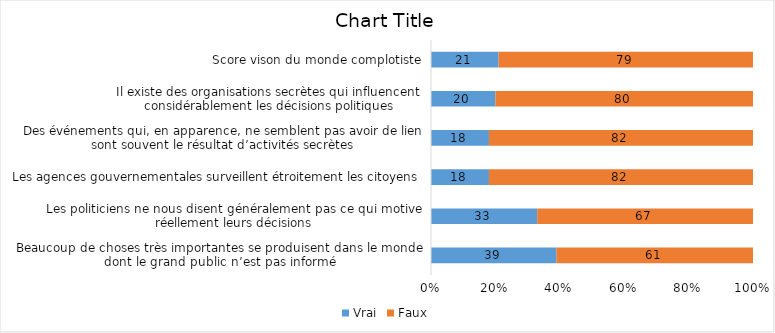
| Category | Vrai | Faux |
|---|---|---|
| Beaucoup de choses très importantes se produisent dans le monde dont le grand public n’est pas informé | 39 | 61 |
| Les politiciens ne nous disent généralement pas ce qui motive réellement leurs décisions | 33 | 67 |
| Les agences gouvernementales surveillent étroitement les citoyens | 18 | 82 |
| Des événements qui, en apparence, ne semblent pas avoir de lien sont souvent le résultat d’activités secrètes | 18 | 82 |
| Il existe des organisations secrètes qui influencent considérablement les décisions politiques | 20 | 80 |
| Score vison du monde complotiste | 21 | 79 |